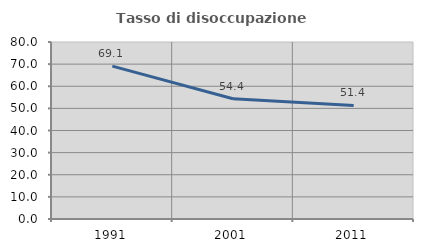
| Category | Tasso di disoccupazione giovanile  |
|---|---|
| 1991.0 | 69.11 |
| 2001.0 | 54.369 |
| 2011.0 | 51.351 |